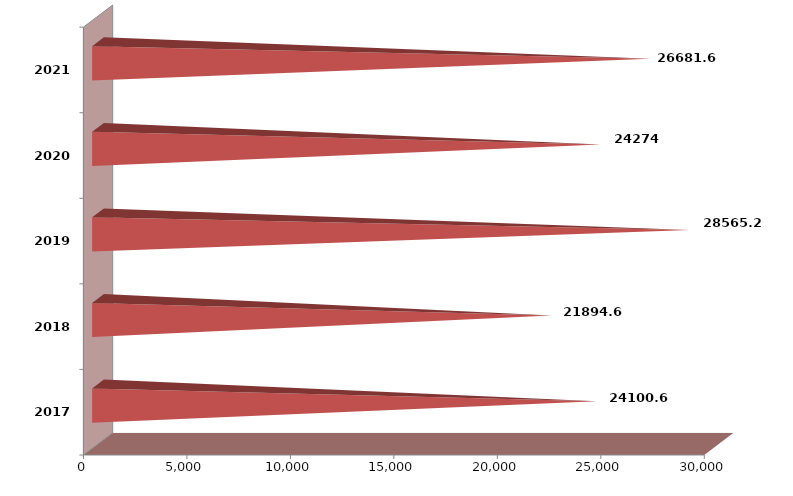
| Category | Series 1 |
|---|---|
| 2017 | 24100596 |
| 2018 | 21894629 |
| 2019 | 28565244 |
| 2020 | 24274424 |
| 2021 | 26681569 |